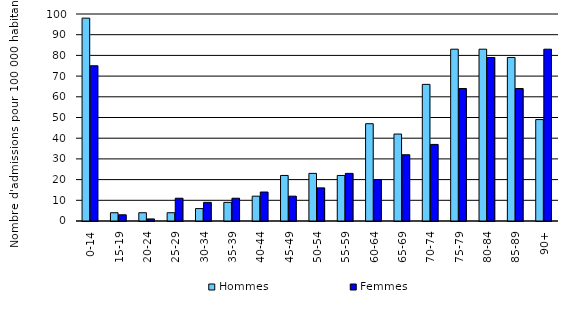
| Category | Hommes | Femmes |
|---|---|---|
| 0-14 | 98 | 75 |
| 15-19 | 4 | 3 |
| 20-24 | 4 | 1 |
| 25-29 | 4 | 11 |
| 30-34 | 6 | 9 |
| 35-39 | 9 | 11 |
| 40-44 | 12 | 14 |
| 45-49 | 22 | 12 |
| 50-54 | 23 | 16 |
| 55-59 | 22 | 23 |
| 60-64 | 47 | 20 |
| 65-69 | 42 | 32 |
| 70-74 | 66 | 37 |
| 75-79 | 83 | 64 |
| 80-84 | 83 | 79 |
| 85-89 | 79 | 64 |
| 90+ | 49 | 83 |